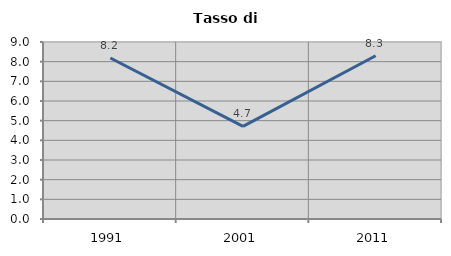
| Category | Tasso di disoccupazione   |
|---|---|
| 1991.0 | 8.185 |
| 2001.0 | 4.707 |
| 2011.0 | 8.299 |